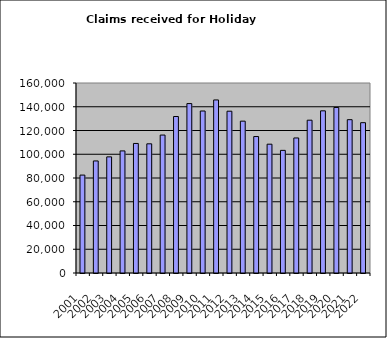
| Category | Series 0 |
|---|---|
| 2001.0 | 82454 |
| 2002.0 | 94358 |
| 2003.0 | 97793 |
| 2004.0 | 102813 |
| 2005.0 | 109089 |
| 2006.0 | 108785 |
| 2007.0 | 116159 |
| 2008.0 | 131779 |
| 2009.0 | 142663 |
| 2010.0 | 136417 |
| 2011.0 | 145734 |
| 2012.0 | 136250 |
| 2013.0 | 127876 |
| 2014.0 | 114913 |
| 2015.0 | 108465 |
| 2016.0 | 103273 |
| 2017.0 | 113720 |
| 2018.0 | 128673 |
| 2019.0 | 136561 |
| 2020.0 | 139390 |
| 2021.0 | 129115 |
| 2022.0 | 126580 |